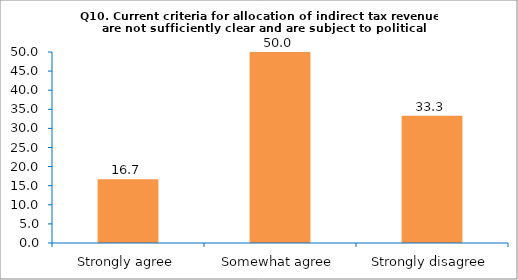
| Category | Series 0 |
|---|---|
| Strongly agree | 16.667 |
| Somewhat agree | 50 |
| Strongly disagree | 33.333 |